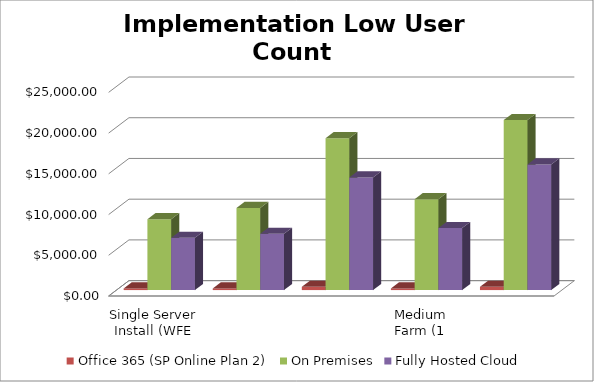
| Category | Office 365 (SP Online Plan 2) | On Premises | Fully Hosted Cloud |
|---|---|---|---|
| Single Server Install (WFE and SQL on 1 VM) | 200 | 8696.269 | 6420 |
| Small Farm - Two Server Install (WFE and SQL) | 200 | 10084.608 | 6910 |
| Small Farm w/ High Availability (2 WFE - 2 SQL) | 400 | 18652.043 | 13825 |
| Medium Farm (1 WFE, 1 App/Index, 1 SQL) | 200 | 11157.455 | 7610 |
| Medium Farm w/ High Availability (2 WFE, 2 A/I, 2 SQL) | 400 | 20871.894 | 15415 |